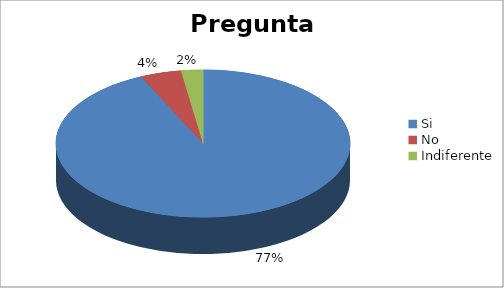
| Category | Series 0 |
|---|---|
| Si | 0.772 |
| No | 0.038 |
| Indiferente | 0.02 |